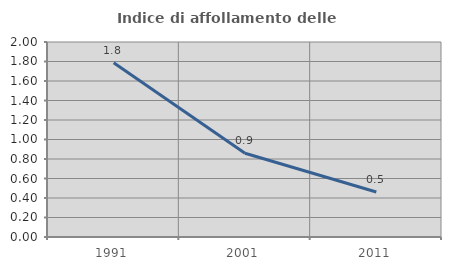
| Category | Indice di affollamento delle abitazioni  |
|---|---|
| 1991.0 | 1.787 |
| 2001.0 | 0.858 |
| 2011.0 | 0.462 |